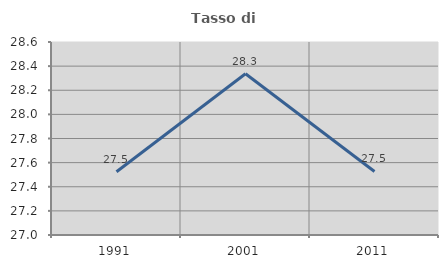
| Category | Tasso di occupazione   |
|---|---|
| 1991.0 | 27.525 |
| 2001.0 | 28.337 |
| 2011.0 | 27.527 |